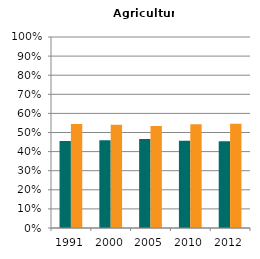
| Category | Male | Female |
|---|---|---|
| 1991.0 | 0.455 | 0.545 |
| 2000.0 | 0.459 | 0.541 |
| 2005.0 | 0.466 | 0.534 |
| 2010.0 | 0.456 | 0.544 |
| 2012.0 | 0.454 | 0.546 |